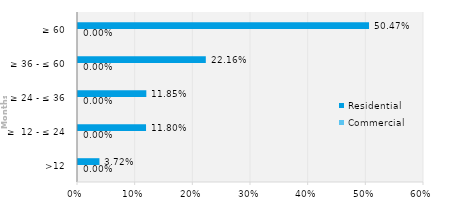
| Category | Commercial | Residential |
|---|---|---|
| >12 | 0 | 0.037 |
| ≥  12 - ≤ 24 | 0 | 0.118 |
| ≥ 24 - ≤ 36 | 0 | 0.118 |
| ≥ 36 - ≤ 60 | 0 | 0.222 |
| ≥ 60 | 0 | 0.505 |